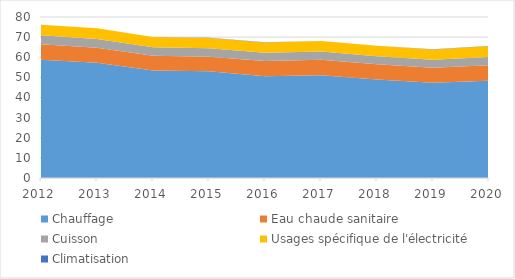
| Category | Chauffage | Eau chaude sanitaire | Cuisson | Usages spécifique de l'électricité | Climatisation |
|---|---|---|---|---|---|
| 2012.0 | 58.795 | 7.669 | 4.494 | 5.166 | 0.034 |
| 2013.0 | 57.212 | 7.457 | 4.34 | 5.348 | 0.038 |
| 2014.0 | 53.38 | 7.35 | 4.233 | 5.07 | 0.04 |
| 2015.0 | 53.056 | 7.223 | 4.187 | 5.133 | 0.044 |
| 2016.0 | 50.619 | 7.543 | 4.016 | 5.196 | 0.059 |
| 2017.0 | 51.054 | 7.691 | 4.093 | 5.197 | 0.06 |
| 2018.0 | 48.94 | 7.552 | 4.012 | 5.179 | 0.069 |
| 2019.0 | 47.307 | 7.489 | 3.948 | 5.119 | 0.086 |
| 2020.0 | 48.37 | 7.717 | 4.1 | 5.255 | 0.116 |